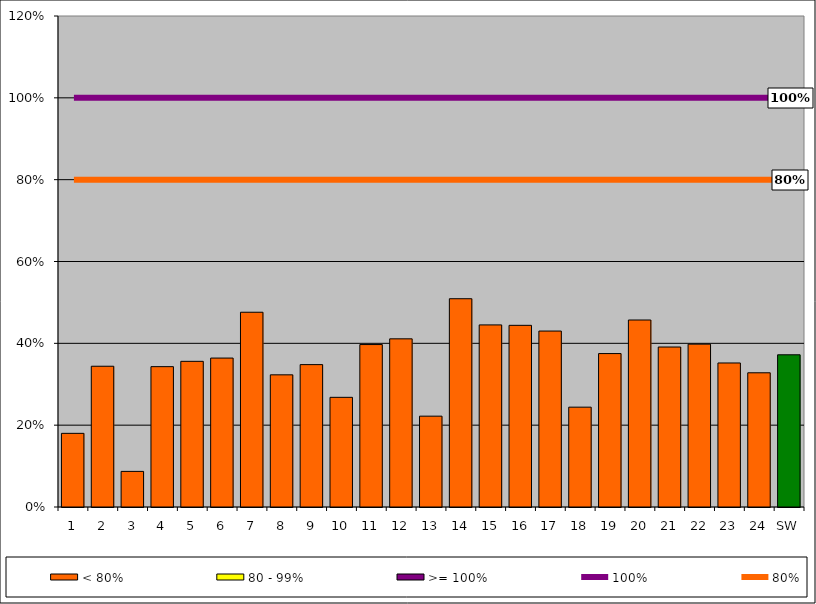
| Category | < 80% | 80 - 99% | >= 100% |
|---|---|---|---|
| 1 | 0.18 | 0 | 0 |
| 2 | 0.344 | 0 | 0 |
| 3 | 0.087 | 0 | 0 |
| 4 | 0.343 | 0 | 0 |
| 5 | 0.356 | 0 | 0 |
| 6 | 0.364 | 0 | 0 |
| 7 | 0.476 | 0 | 0 |
| 8 | 0.323 | 0 | 0 |
| 9 | 0.348 | 0 | 0 |
| 10 | 0.268 | 0 | 0 |
| 11 | 0.397 | 0 | 0 |
| 12 | 0.411 | 0 | 0 |
| 13 | 0.222 | 0 | 0 |
| 14 | 0.509 | 0 | 0 |
| 15 | 0.445 | 0 | 0 |
| 16 | 0.444 | 0 | 0 |
| 17 | 0.43 | 0 | 0 |
| 18 | 0.244 | 0 | 0 |
| 19 | 0.375 | 0 | 0 |
| 20 | 0.457 | 0 | 0 |
| 21 | 0.391 | 0 | 0 |
| 22 | 0.398 | 0 | 0 |
| 23 | 0.352 | 0 | 0 |
| 24 | 0.328 | 0 | 0 |
| SW | 0.372 | 0 | 0 |